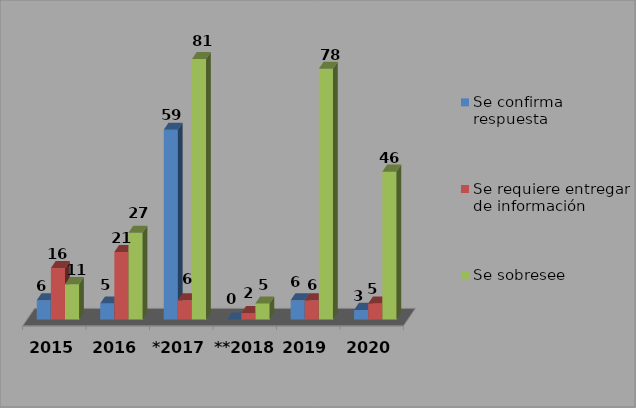
| Category | Se confirma respuesta | Se requiere entregar de información  | Se sobresee  |
|---|---|---|---|
| 2015 | 6 | 16 | 11 |
| 2016 | 5 | 21 | 27 |
| *2017 | 59 | 6 | 81 |
| **2018 | 0 | 2 | 5 |
| 2019 | 6 | 6 | 78 |
| 2020 | 3 | 5 | 46 |